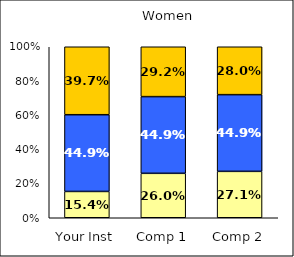
| Category | Low Civic Awareness | Average Civic Awareness | High Civic Awareness |
|---|---|---|---|
| Your Inst | 0.154 | 0.449 | 0.397 |
| Comp 1 | 0.26 | 0.449 | 0.292 |
| Comp 2 | 0.271 | 0.449 | 0.28 |